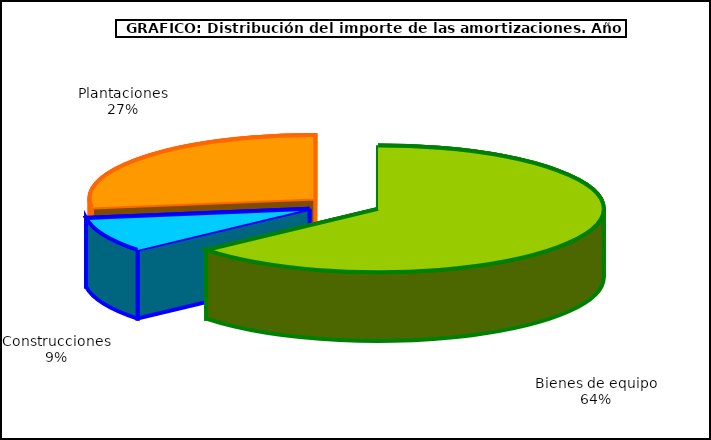
| Category | Series 0 |
|---|---|
| Bienes de equipo | 3348.913 |
| Construcciones | 468.907 |
| Plantaciones | 1433.71 |